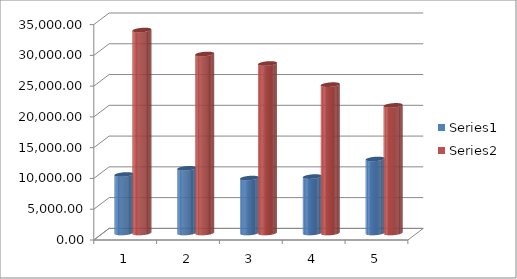
| Category | Series 0 | Series 1 |
|---|---|---|
| 0 | 9508.55 | 32978.74 |
| 1 | 10513.98 | 29084 |
| 2 | 8928.68 | 27539.2 |
| 3 | 9169.49 | 24110.35 |
| 4 | 12030.28 | 20737.77 |